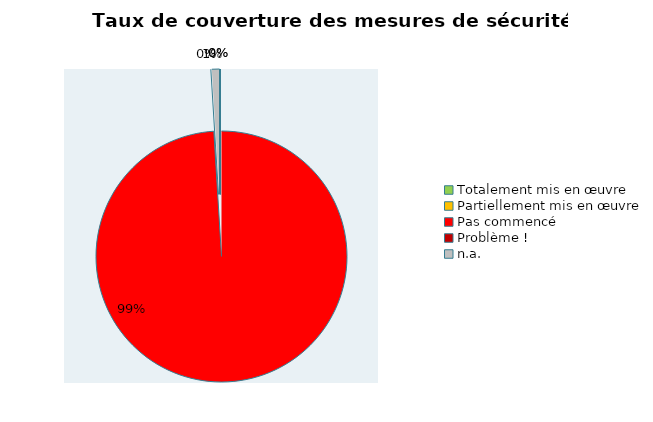
| Category | Series 0 |
|---|---|
| Totalement mis en œuvre | 0 |
| Partiellement mis en œuvre | 0 |
| Pas commencé | 203 |
| Problème ! | 0 |
| n.a. | 2 |